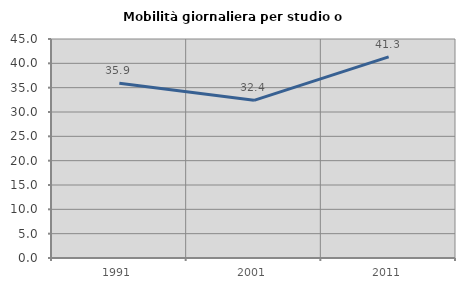
| Category | Mobilità giornaliera per studio o lavoro |
|---|---|
| 1991.0 | 35.888 |
| 2001.0 | 32.394 |
| 2011.0 | 41.341 |